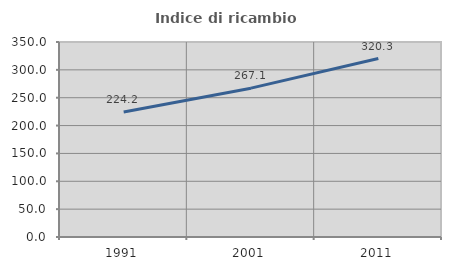
| Category | Indice di ricambio occupazionale  |
|---|---|
| 1991.0 | 224.211 |
| 2001.0 | 267.143 |
| 2011.0 | 320.339 |